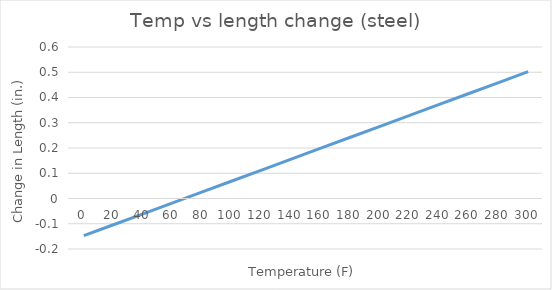
| Category | Temp vs length change |
|---|---|
| 0.0 | -0.147 |
| 20.0 | -0.104 |
| 40.0 | -0.061 |
| 60.0 | -0.017 |
| 80.0 | 0.026 |
| 100.0 | 0.069 |
| 120.0 | 0.113 |
| 140.0 | 0.156 |
| 160.0 | 0.199 |
| 180.0 | 0.243 |
| 200.0 | 0.286 |
| 220.0 | 0.329 |
| 240.0 | 0.373 |
| 260.0 | 0.416 |
| 280.0 | 0.459 |
| 300.0 | 0.503 |